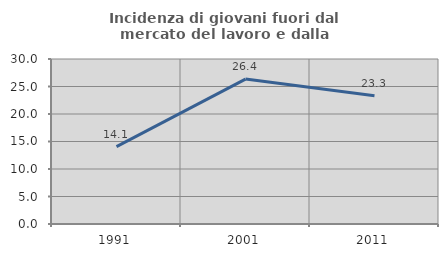
| Category | Incidenza di giovani fuori dal mercato del lavoro e dalla formazione  |
|---|---|
| 1991.0 | 14.072 |
| 2001.0 | 26.353 |
| 2011.0 | 23.317 |